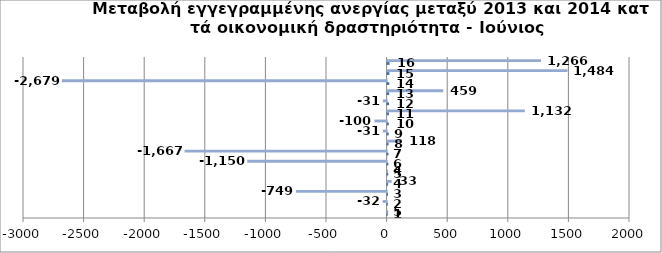
| Category | Series 0 | Series 1 |
|---|---|---|
| 0 | 1 | 5 |
| 1 | 2 | -32 |
| 2 | 3 | -749 |
| 3 | 4 | 33 |
| 4 | 5 | 4 |
| 5 | 6 | -1150 |
| 6 | 7 | -1667 |
| 7 | 8 | 118 |
| 8 | 9 | -31 |
| 9 | 10 | -100 |
| 10 | 11 | 1132 |
| 11 | 12 | -31 |
| 12 | 13 | 459 |
| 13 | 14 | -2679 |
| 14 | 15 | 1484 |
| 15 | 16 | 1266 |